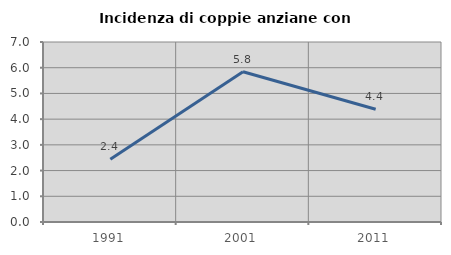
| Category | Incidenza di coppie anziane con figli |
|---|---|
| 1991.0 | 2.439 |
| 2001.0 | 5.844 |
| 2011.0 | 4.386 |